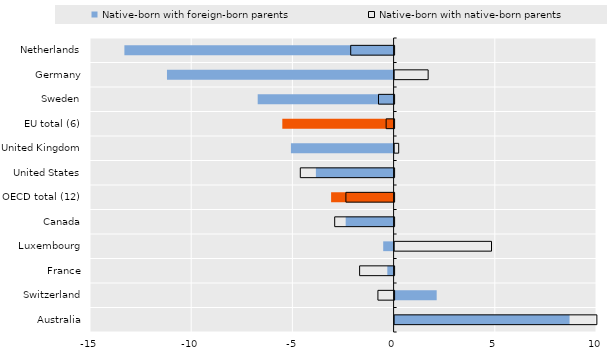
| Category | Native-born with foreign-born parents | Native-born with native-born parents |
|---|---|---|
| Netherlands | -13.3 | -2.144 |
| Germany | -11.197 | 1.658 |
| Sweden | -6.714 | -0.771 |
| EU total (6) | -5.499 | -0.393 |
| United Kingdom | -5.072 | 0.202 |
| United States | -3.84 | -4.634 |
| OECD total (12) | -3.088 | -2.382 |
| Canada | -2.368 | -2.935 |
| Luxembourg | -0.514 | 4.788 |
| France | -0.31 | -1.704 |
| Switzerland | 2.079 | -0.799 |
| Australia | 8.644 | 9.994 |